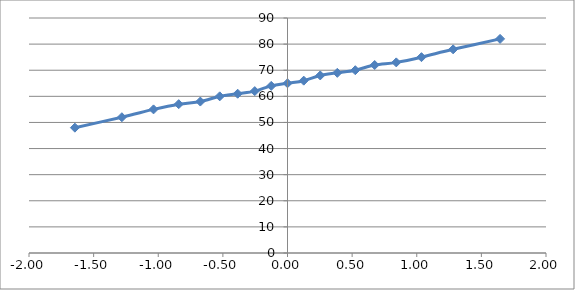
| Category | Series 0 |
|---|---|
| -1.6448536269514726 | 48 |
| -1.2815515655446006 | 52 |
| -1.0364333894937898 | 55 |
| -0.8416212335729145 | 57 |
| -0.6744897501960819 | 58 |
| -0.5244005127080409 | 60 |
| -0.38532046640756784 | 61 |
| -0.2533471031357998 | 62 |
| -0.12566134685507402 | 64 |
| 0.0 | 65 |
| 0.12566134685507416 | 66 |
| 0.2533471031357998 | 68 |
| 0.38532046640756784 | 69 |
| 0.5244005127080408 | 70 |
| 0.6744897501960819 | 72 |
| 0.8416212335729147 | 73 |
| 1.0364333894937898 | 75 |
| 1.2815515655446006 | 78 |
| 1.6448536269514715 | 82 |